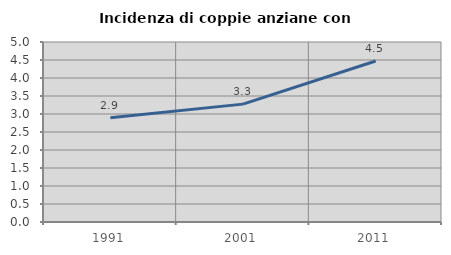
| Category | Incidenza di coppie anziane con figli |
|---|---|
| 1991.0 | 2.899 |
| 2001.0 | 3.274 |
| 2011.0 | 4.472 |